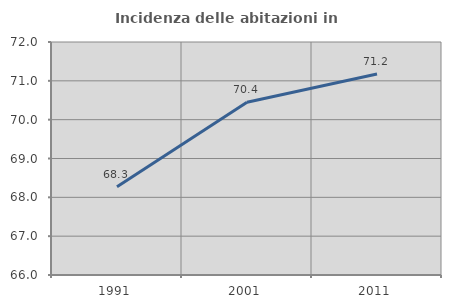
| Category | Incidenza delle abitazioni in proprietà  |
|---|---|
| 1991.0 | 68.272 |
| 2001.0 | 70.448 |
| 2011.0 | 71.175 |